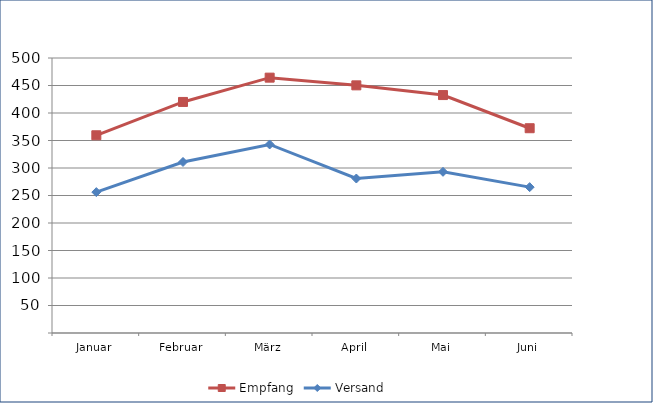
| Category | Empfang | Versand |
|---|---|---|
| Januar | 359.49 | 256.145 |
| Februar | 420.107 | 310.953 |
| März | 464.282 | 342.779 |
| April | 450.278 | 280.872 |
| Mai | 432.607 | 293.041 |
| Juni | 372.303 | 265.188 |